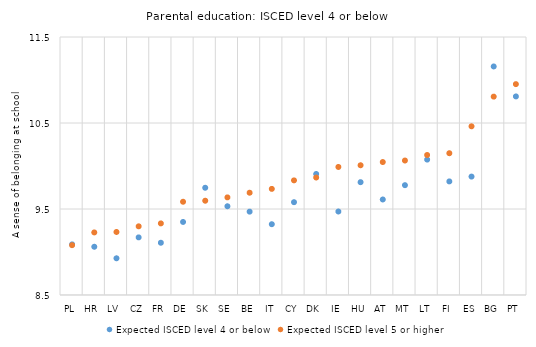
| Category | Expected ISCED level 4 or below | Expected ISCED level 5 or higher |
|---|---|---|
| PL | 9.089 | 9.079 |
| HR | 9.061 | 9.228 |
| LV | 8.927 | 9.233 |
| CZ | 9.17 | 9.299 |
| FR | 9.108 | 9.332 |
| DE | 9.349 | 9.584 |
| SK | 9.747 | 9.596 |
| SE | 9.532 | 9.635 |
| BE | 9.469 | 9.689 |
| IT | 9.323 | 9.734 |
| CY | 9.579 | 9.833 |
| DK | 9.907 | 9.866 |
| IE | 9.471 | 9.989 |
| HU | 9.812 | 10.009 |
| AT | 9.61 | 10.046 |
| MT | 9.777 | 10.064 |
| LT | 10.075 | 10.128 |
| FI | 9.821 | 10.149 |
| ES | 9.877 | 10.462 |
| BG | 11.158 | 10.807 |
| PT | 10.809 | 10.952 |